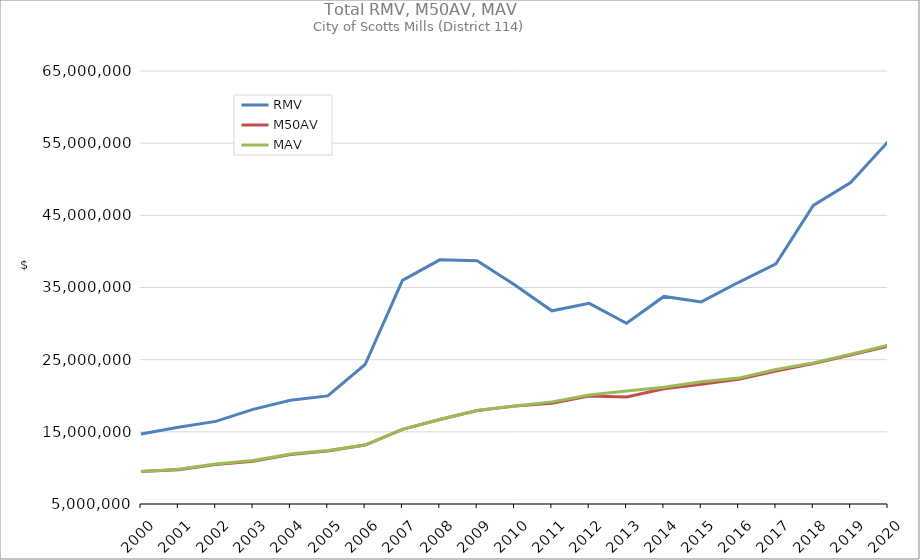
| Category | RMV | M50AV | MAV |
|---|---|---|---|
| 2000.0 | 14690687 | 9491889 | 9499441 |
| 2001.0 | 15623790 | 9755711 | 9824851 |
| 2002.0 | 16447083 | 10473330 | 10541130 |
| 2003.0 | 18118627 | 10929017 | 11032477 |
| 2004.0 | 19373852 | 11843252 | 11927562 |
| 2005.0 | 19980645 | 12334755 | 12405380 |
| 2006.0 | 24327647 | 13163527 | 13171733 |
| 2007.0 | 35994537 | 15348145 | 15346681 |
| 2008.0 | 38833013 | 16709332 | 16707535 |
| 2009.0 | 38709575 | 17951770 | 17951210 |
| 2010.0 | 35390918 | 18562283 | 18579523 |
| 2011.0 | 31771590 | 18949979 | 19149529 |
| 2012.0 | 32799624 | 19953761 | 20106217 |
| 2013.0 | 30046208 | 19834854 | 20662437 |
| 2014.0 | 33763999 | 20964461 | 21169817 |
| 2015.0 | 33001035 | 21595907 | 21942453 |
| 2016.0 | 35722215 | 22290668 | 22446113 |
| 2017.0 | 38268196 | 23431590 | 23639540 |
| 2018.0 | 46378830 | 24452000 | 24551925 |
| 2019.0 | 49548153 | 25641428 | 25758423 |
| 2020.0 | 55207379 | 26869079 | 26986072 |